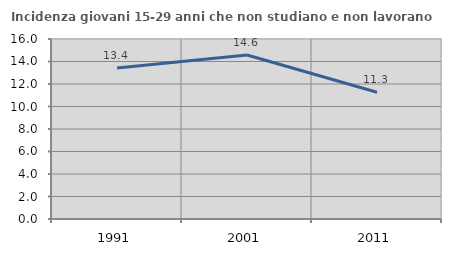
| Category | Incidenza giovani 15-29 anni che non studiano e non lavorano  |
|---|---|
| 1991.0 | 13.413 |
| 2001.0 | 14.579 |
| 2011.0 | 11.268 |